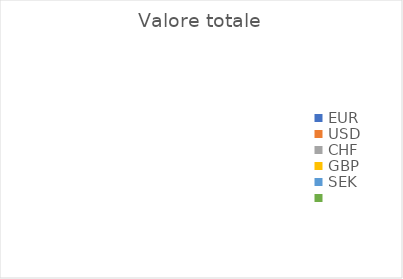
| Category | Valore totale |
|---|---|
| EUR | 0 |
| USD | 0 |
| CHF | 0 |
| GBP | 0 |
| SEK | 0 |